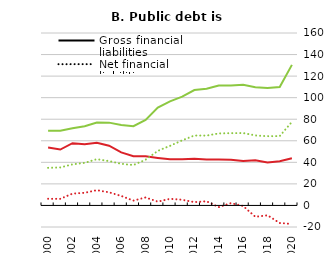
| Category | Gross financial liabilities | Net financial liabilities |
|---|---|---|
| 2000.0 |  |  |
| 2001.0 |  |  |
| 2002.0 |  |  |
| 2003.0 |  |  |
| 2004.0 |  |  |
| 2005.0 |  |  |
| 2006.0 |  |  |
| 2007.0 |  |  |
| 2008.0 |  |  |
| 2009.0 |  |  |
| 2010.0 |  |  |
| 2011.0 |  |  |
| 2012.0 |  |  |
| 2013.0 |  |  |
| 2014.0 |  |  |
| 2015.0 |  |  |
| 2016.0 |  |  |
| 2017.0 |  |  |
| 2018.0 |  |  |
| 2019.0 |  |  |
| 2020.0 |  |  |